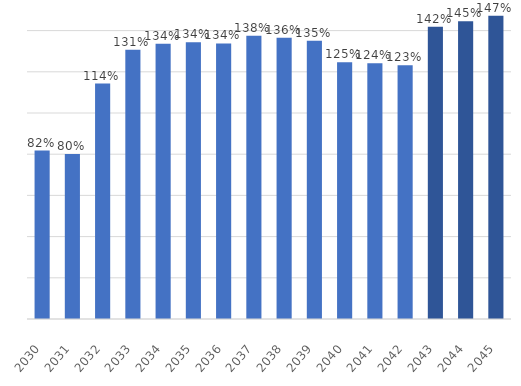
| Category | Percentage Clean Energy |
|---|---|
| 2030.0 | 0.818 |
| 2031.0 | 0.801 |
| 2032.0 | 1.143 |
| 2033.0 | 1.306 |
| 2034.0 | 1.336 |
| 2035.0 | 1.343 |
| 2036.0 | 1.338 |
| 2037.0 | 1.375 |
| 2038.0 | 1.365 |
| 2039.0 | 1.351 |
| 2040.0 | 1.246 |
| 2041.0 | 1.241 |
| 2042.0 | 1.232 |
| 2043.0 | 1.418 |
| 2044.0 | 1.445 |
| 2045.0 | 1.472 |